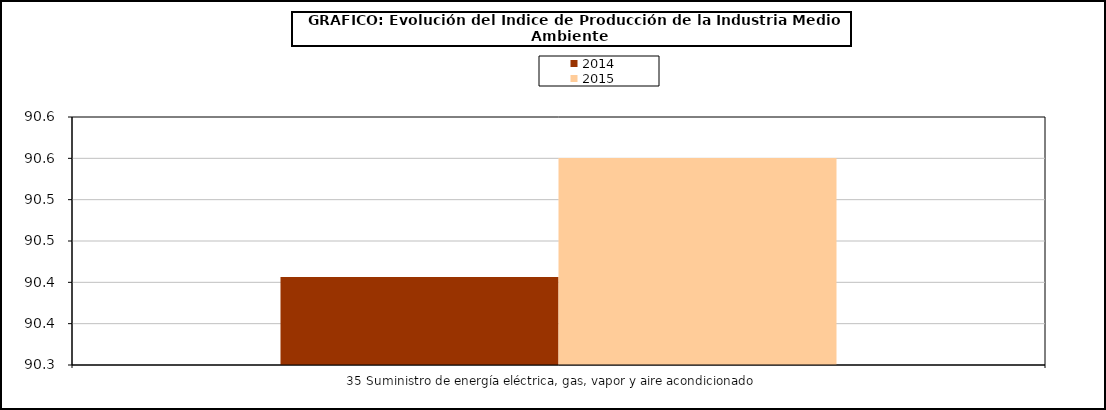
| Category | 2014 | 2015 |
|---|---|---|
| 35 Suministro de energía eléctrica, gas, vapor y aire acondicionado     | 90.406 | 90.55 |